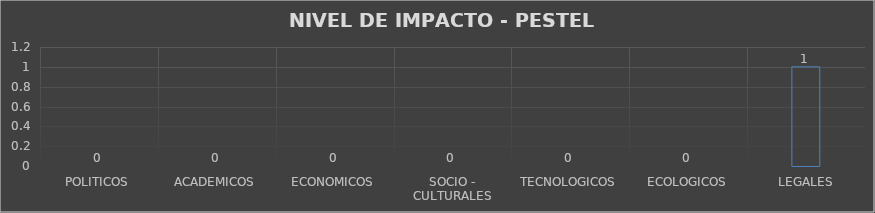
| Category | Series 0 |
|---|---|
| POLITICOS | 0 |
| ACADEMICOS | 0 |
| ECONOMICOS | 0 |
| SOCIO - CULTURALES | 0 |
| TECNOLOGICOS | 0 |
| ECOLOGICOS | 0 |
| LEGALES | 1 |